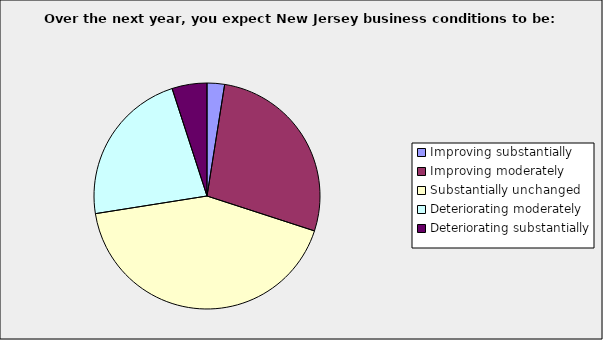
| Category | Series 0 |
|---|---|
| Improving substantially | 0.025 |
| Improving moderately | 0.275 |
| Substantially unchanged | 0.425 |
| Deteriorating moderately | 0.225 |
| Deteriorating substantially | 0.05 |